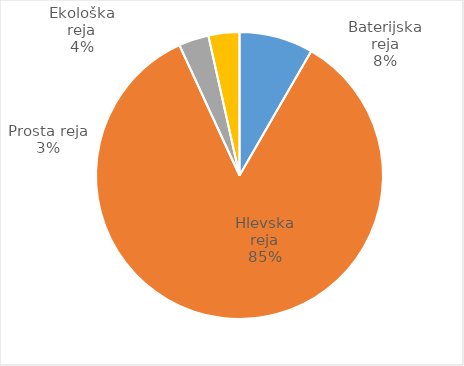
| Category | Število kosov jajc |
|---|---|
| Baterijska reja | 277844 |
| Hlevska reja | 2830329 |
| Prosta reja | 113178 |
| Ekološka reja | 116430 |